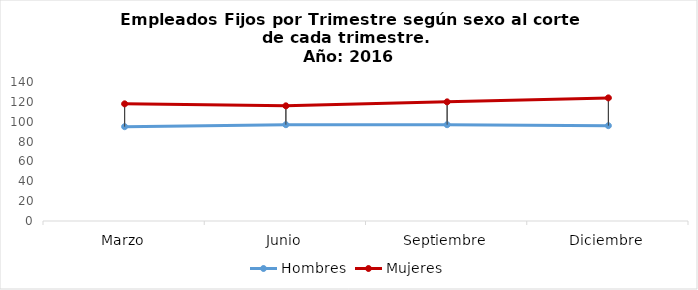
| Category | Hombres | Mujeres |
|---|---|---|
| Marzo | 95 | 118 |
| Junio | 97 | 116 |
| Septiembre | 97 | 120 |
| Diciembre | 96 | 124 |